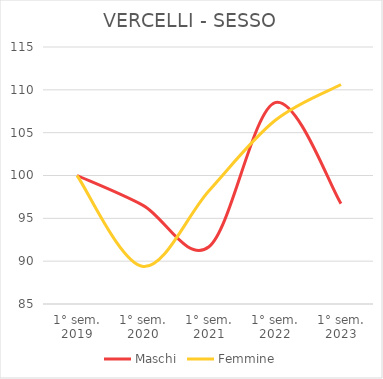
| Category | Maschi | Femmine |
|---|---|---|
| 1° sem.
2019 | 100 | 100 |
| 1° sem.
2020 | 96.518 | 89.381 |
| 1° sem.
2021 | 91.683 | 98.23 |
| 1° sem.
2022 | 108.511 | 106.416 |
| 1° sem.
2023 | 96.712 | 110.619 |